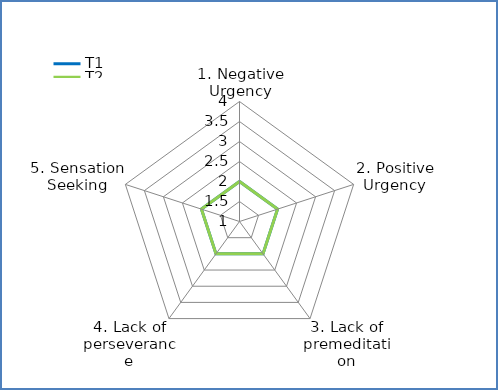
| Category | T1 | T2 |
|---|---|---|
| 1. Negative Urgency | 0 | 0 |
| 2. Positive Urgency | 0 | 0 |
| 3. Lack of premeditation | 0 | 0 |
| 4. Lack of perseverance | 0 | 0 |
| 5. Sensation Seeking | 0 | 0 |